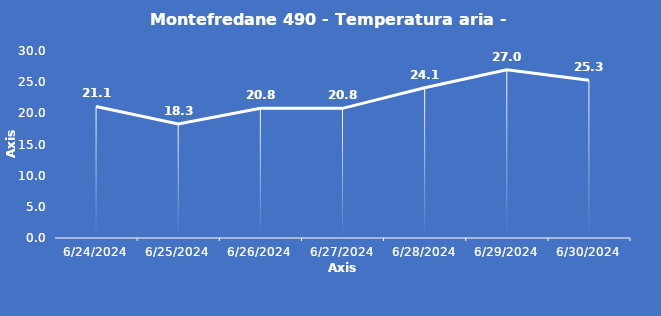
| Category | Montefredane 490 - Temperatura aria - Grezzo (°C) |
|---|---|
| 6/24/24 | 21.1 |
| 6/25/24 | 18.3 |
| 6/26/24 | 20.8 |
| 6/27/24 | 20.8 |
| 6/28/24 | 24.1 |
| 6/29/24 | 27 |
| 6/30/24 | 25.3 |